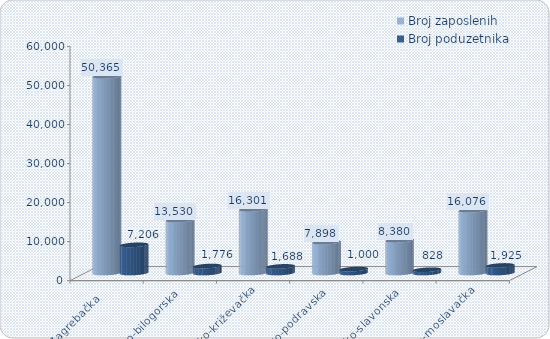
| Category | Broj zaposlenih | Broj poduzetnika |
|---|---|---|
| Zagrebačka   | 50365 | 7206 |
| Bjelovarsko-bilogorska  | 13530 | 1776 |
| Koprivničko-križevačka | 16301 | 1688 |
| Virovitičko-podravska | 7898 | 1000 |
| Požeško-slavonska | 8380 | 828 |
| Sisačko-moslavačka | 16076 | 1925 |